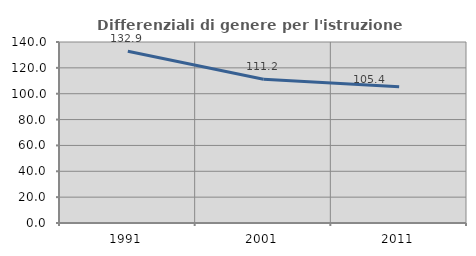
| Category | Differenziali di genere per l'istruzione superiore |
|---|---|
| 1991.0 | 132.889 |
| 2001.0 | 111.233 |
| 2011.0 | 105.356 |